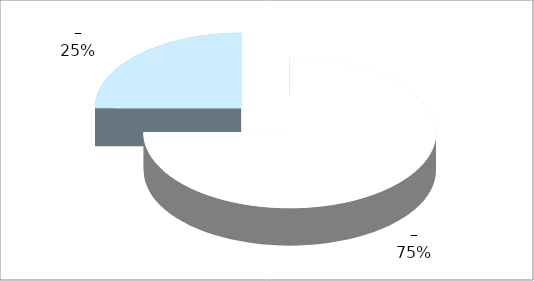
| Category | Series 0 |
|---|---|
| 0 | 3 |
| 1 | 1 |